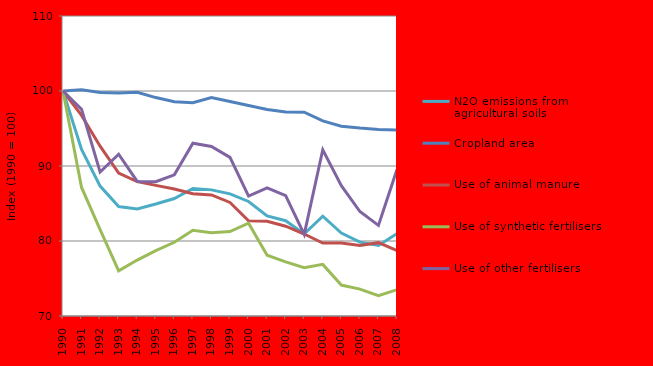
| Category | N2O emissions from agricultural soils | Cropland area | Use of animal manure | Use of synthetic fertilisers | Use of other fertilisers |
|---|---|---|---|---|---|
| 1990.0 | 100 | 100 | 100 | 100 | 100 |
| 1991.0 | 92.22 | 100.166 | 96.752 | 87.141 | 97.55 |
| 1992.0 | 87.321 | 99.804 | 92.645 | 81.517 | 89.193 |
| 1993.0 | 84.592 | 99.73 | 89.065 | 76.024 | 91.569 |
| 1994.0 | 84.284 | 99.836 | 87.933 | 77.462 | 87.94 |
| 1995.0 | 84.932 | 99.124 | 87.42 | 78.718 | 87.901 |
| 1996.0 | 85.662 | 98.556 | 86.93 | 79.83 | 88.825 |
| 1997.0 | 87.009 | 98.447 | 86.313 | 81.424 | 93.042 |
| 1998.0 | 86.818 | 99.137 | 86.14 | 81.117 | 92.597 |
| 1999.0 | 86.282 | 98.591 | 85.146 | 81.263 | 91.149 |
| 2000.0 | 85.271 | 98.065 | 82.703 | 82.375 | 85.984 |
| 2001.0 | 83.343 | 97.546 | 82.632 | 78.1 | 87.083 |
| 2002.0 | 82.702 | 97.211 | 81.971 | 77.219 | 86.056 |
| 2003.0 | 80.949 | 97.17 | 80.931 | 76.427 | 80.883 |
| 2004.0 | 83.305 | 96.017 | 79.723 | 76.883 | 92.163 |
| 2005.0 | 81.061 | 95.302 | 79.741 | 74.131 | 87.377 |
| 2006.0 | 79.844 | 95.052 | 79.394 | 73.588 | 83.933 |
| 2007.0 | 79.398 | 94.869 | 79.779 | 72.725 | 82.077 |
| 2008.0 | 80.997 | 94.802 | 78.717 | 73.512 | 89.531 |